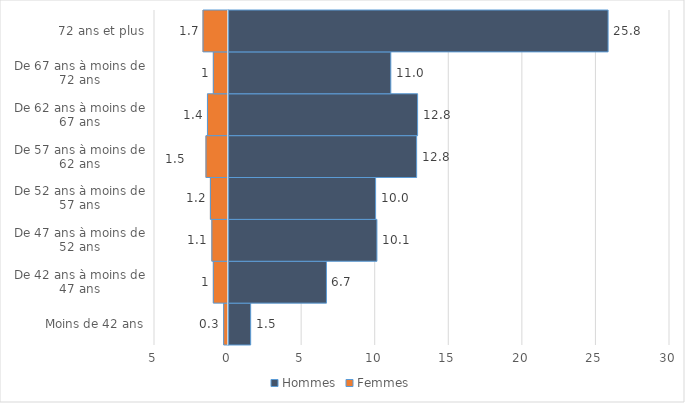
| Category | Hommes | Femmes |
|---|---|---|
| Moins de 42 ans | 1.502 | -0.3 |
| De 42 ans à moins de 47 ans | 6.652 | -1 |
| De 47 ans à moins de 52 ans | 10.083 | -1.1 |
| De 52 ans à moins de 57 ans | 9.992 | -1.2 |
| De 57 ans à moins de 62 ans | 12.781 | -1.5 |
| De 62 ans à moins de 67 ans | 12.846 | -1.4 |
| De 67 ans à moins de 72 ans | 11.025 | -1 |
| 72 ans et plus | 25.793 | -1.7 |